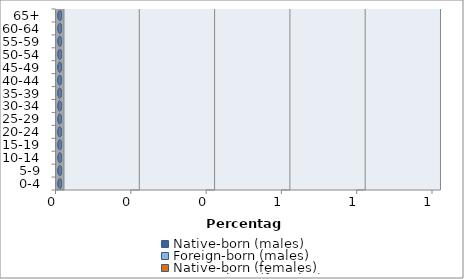
| Category | Native-born (males) | Foreign-born (males) | Native-born (females) | Foreign-born (females) |
|---|---|---|---|---|
| 0-4 | 0 | 0 | 0 | 0 |
| 5-9 | 0 | 0 | 0 | 0 |
| 10-14 | 0 | 0 | 0 | 0 |
| 15-19 | 0 | 0 | 0 | 0 |
| 20-24 | 0 | 0 | 0 | 0 |
| 25-29 | 0 | 0 | 0 | 0 |
| 30-34 | 0 | 0 | 0 | 0 |
| 35-39 | 0 | 0 | 0 | 0 |
| 40-44 | 0 | 0 | 0 | 0 |
| 45-49 | 0 | 0 | 0 | 0 |
| 50-54 | 0 | 0 | 0 | 0 |
| 55-59 | 0 | 0 | 0 | 0 |
| 60-64 | 0 | 0 | 0 | 0 |
| 65+ | 0 | 0 | 0 | 0 |